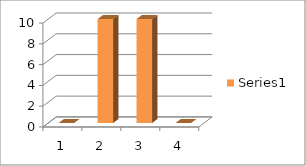
| Category | Series 0 |
|---|---|
| 0 | 0 |
| 1 | 10 |
| 2 | 10 |
| 3 | 0 |